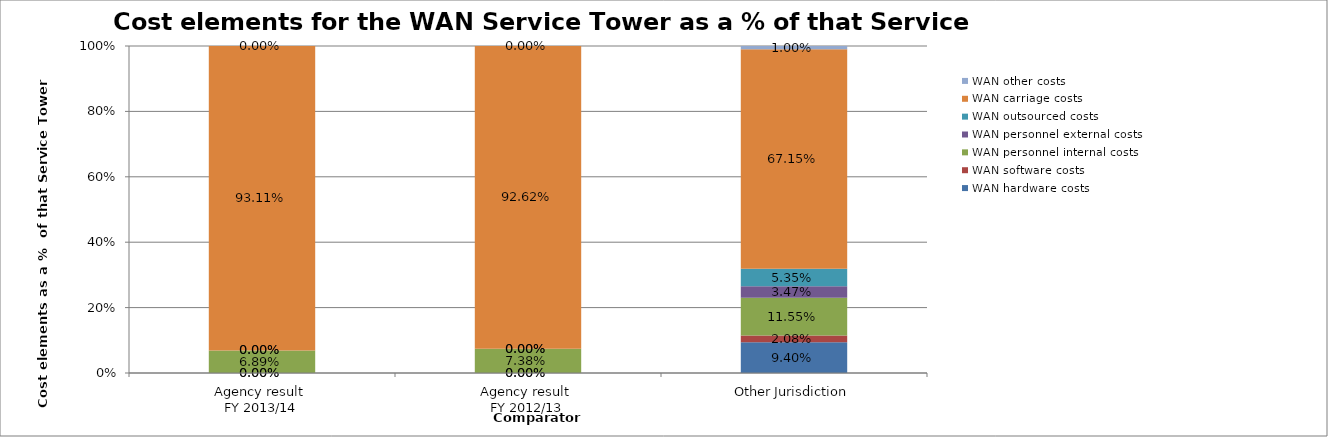
| Category | WAN hardware costs | WAN software costs | WAN personnel internal costs | WAN personnel external costs | WAN outsourced costs | WAN carriage costs | WAN other costs |
|---|---|---|---|---|---|---|---|
| Agency result 
FY 2013/14 | 0 | 0 | 0.069 | 0 | 0 | 0.931 | 0 |
| Agency result 
FY 2012/13 | 0 | 0 | 0.074 | 0 | 0 | 0.926 | 0 |
| Other Jurisdiction | 0.094 | 0.021 | 0.116 | 0.035 | 0.054 | 0.672 | 0.01 |